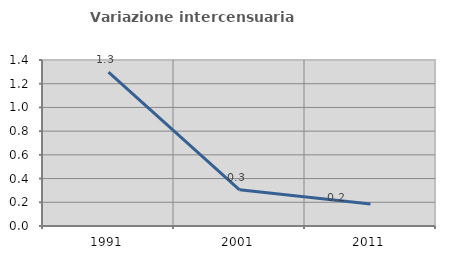
| Category | Variazione intercensuaria annua |
|---|---|
| 1991.0 | 1.299 |
| 2001.0 | 0.306 |
| 2011.0 | 0.185 |